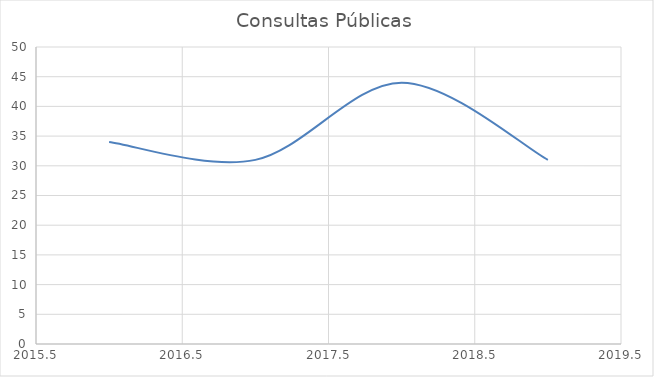
| Category | Consultas Públicas |
|---|---|
| 2016.0 | 34 |
| 2017.0 | 31 |
| 2018.0 | 44 |
| 2019.0 | 31 |